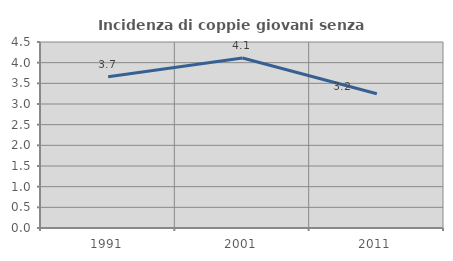
| Category | Incidenza di coppie giovani senza figli |
|---|---|
| 1991.0 | 3.66 |
| 2001.0 | 4.112 |
| 2011.0 | 3.246 |